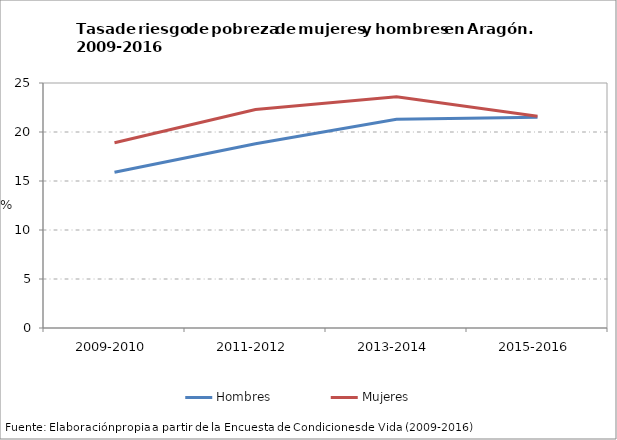
| Category | Hombres | Mujeres |
|---|---|---|
| 2009-2010 | 15.9 | 18.9 |
| 2011-2012 | 18.8 | 22.3 |
| 2013-2014 | 21.3 | 23.6 |
| 2015-2016 | 21.5 | 21.6 |